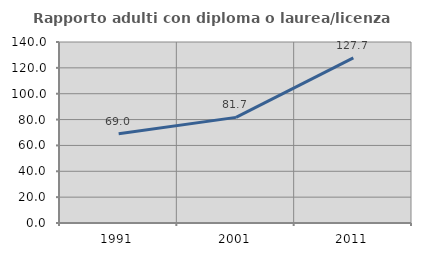
| Category | Rapporto adulti con diploma o laurea/licenza media  |
|---|---|
| 1991.0 | 68.966 |
| 2001.0 | 81.69 |
| 2011.0 | 127.711 |